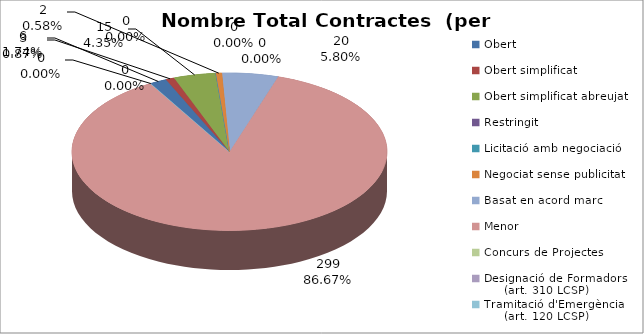
| Category | Nombre Total Contractes |
|---|---|
| Obert | 6 |
| Obert simplificat | 3 |
| Obert simplificat abreujat | 15 |
| Restringit | 0 |
| Licitació amb negociació | 0 |
| Negociat sense publicitat | 2 |
| Basat en acord marc | 20 |
| Menor | 299 |
| Concurs de Projectes | 0 |
| Designació de Formadors
     (art. 310 LCSP) | 0 |
| Tramitació d'Emergència
     (art. 120 LCSP) | 0 |